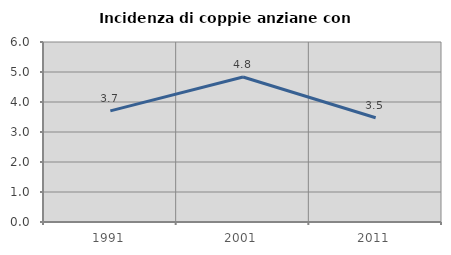
| Category | Incidenza di coppie anziane con figli |
|---|---|
| 1991.0 | 3.704 |
| 2001.0 | 4.835 |
| 2011.0 | 3.474 |